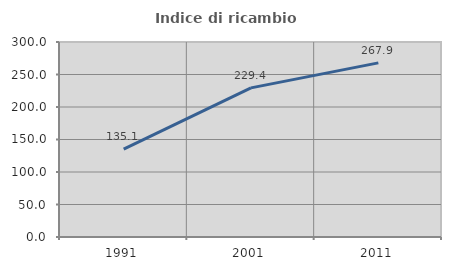
| Category | Indice di ricambio occupazionale  |
|---|---|
| 1991.0 | 135.135 |
| 2001.0 | 229.391 |
| 2011.0 | 267.857 |